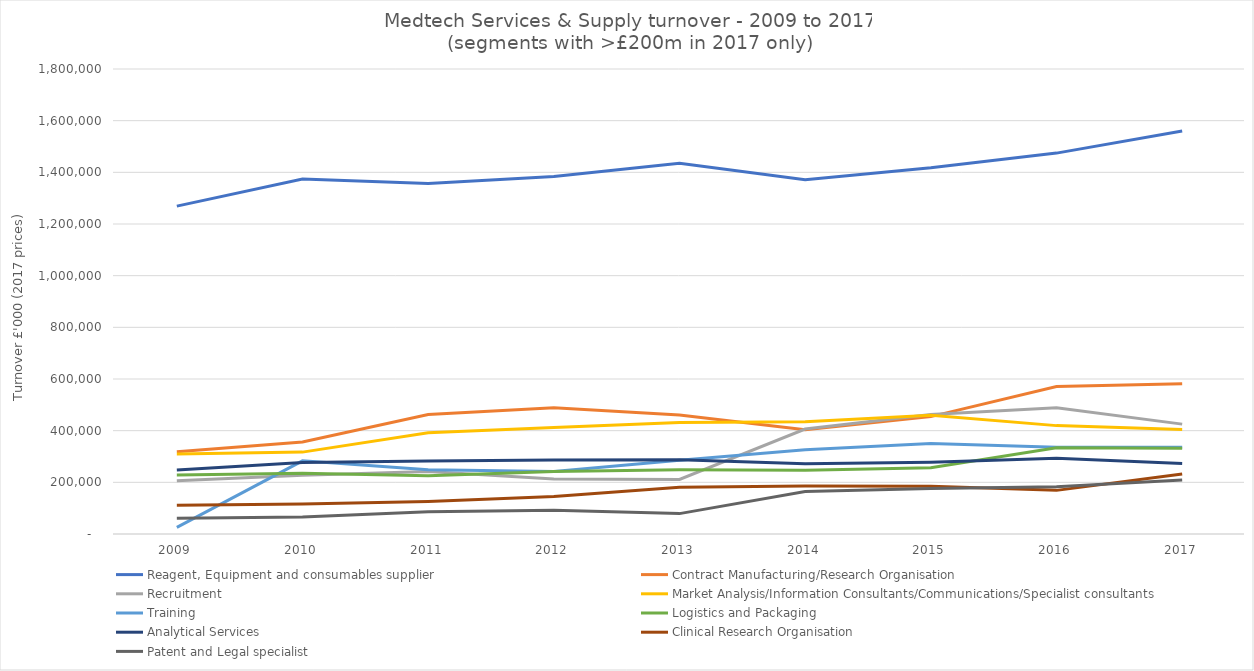
| Category | Reagent, Equipment and consumables supplier | Contract Manufacturing/Research Organisation | Recruitment | Market Analysis/Information Consultants/Communications/Specialist consultants | Training | Logistics and Packaging | Analytical Services | Clinical Research Organisation | Patent and Legal specialist |
|---|---|---|---|---|---|---|---|---|---|
| 2009 | 1269301 | 318116 | 205858 | 309939 | 25374 | 228289 | 247422 | 111071 | 61301 |
| 2010 | 1374373 | 356102 | 227364 | 316973 | 283347 | 235221 | 277065 | 115914 | 65525 |
| 2011 | 1356744 | 462753 | 242236 | 392056 | 248490 | 225458 | 282858 | 125716 | 86311 |
| 2012 | 1384042 | 488834 | 213031 | 412191 | 241587 | 242159 | 286135 | 145095 | 92191 |
| 2013 | 1435414 | 460551 | 211051 | 431711 | 285241 | 248590 | 287841 | 180705 | 78904 |
| 2014 | 1371780 | 403185 | 406109 | 434800 | 325950 | 247030 | 272306 | 185785 | 164834 |
| 2015 | 1417463 | 454397 | 462997 | 459742 | 349946 | 256621 | 277351 | 184982 | 176215 |
| 2016 | 1474402 | 571209 | 488753 | 419523 | 335767 | 333668 | 293033 | 168916 | 182749 |
| 2017 | 1560223 | 581252 | 425323 | 404670 | 335369 | 332379 | 272431 | 231951 | 209012 |